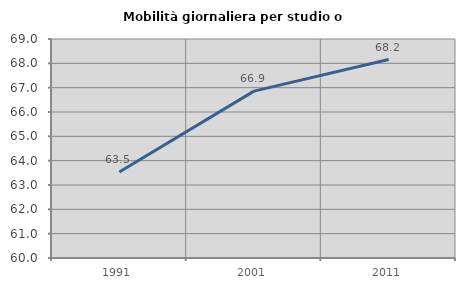
| Category | Mobilità giornaliera per studio o lavoro |
|---|---|
| 1991.0 | 63.536 |
| 2001.0 | 66.857 |
| 2011.0 | 68.156 |